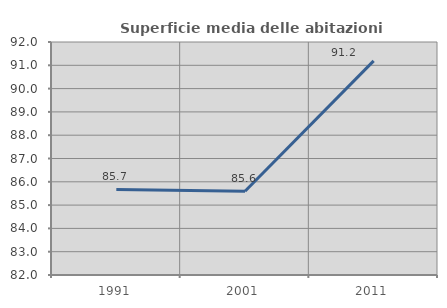
| Category | Superficie media delle abitazioni occupate |
|---|---|
| 1991.0 | 85.67 |
| 2001.0 | 85.595 |
| 2011.0 | 91.19 |